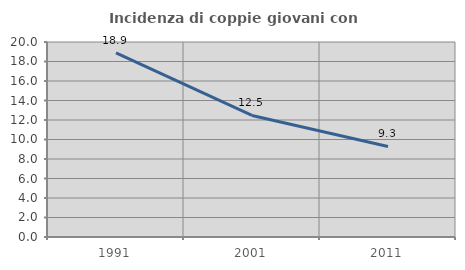
| Category | Incidenza di coppie giovani con figli |
|---|---|
| 1991.0 | 18.894 |
| 2001.0 | 12.463 |
| 2011.0 | 9.282 |